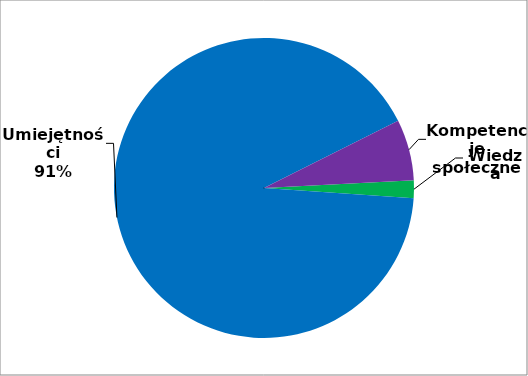
| Category | Series 0 |
|---|---|
| 0 | 12 |
| 1 | 572 |
| 2 | 41 |